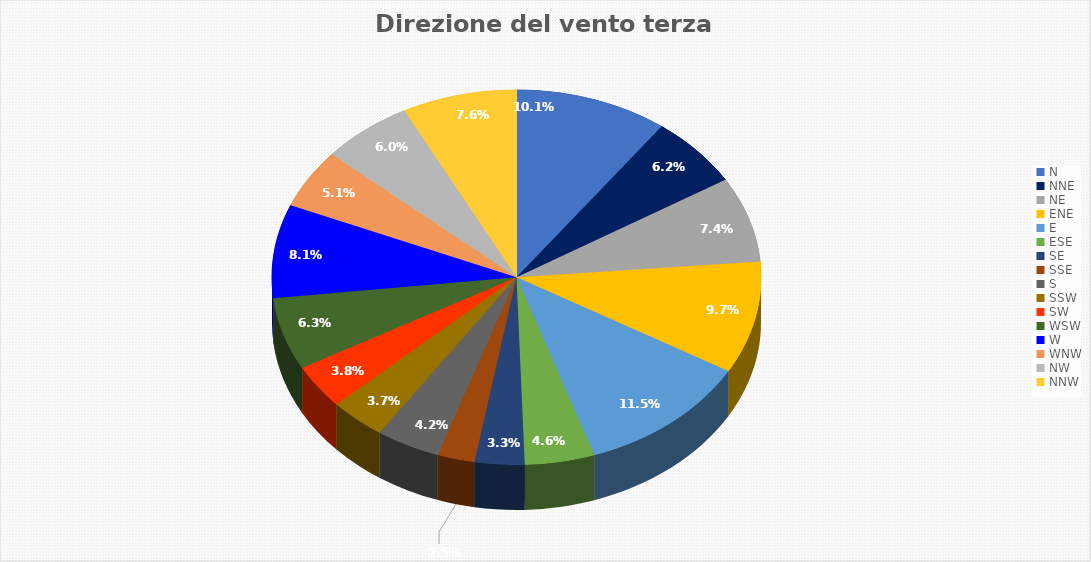
| Category | Percentuale |
|---|---|
| N | 10.107 |
| NNE | 6.191 |
| NE | 7.359 |
| ENE | 9.697 |
| E | 11.497 |
| ESE | 4.611 |
| SE | 3.285 |
| SSE | 2.464 |
| S | 4.232 |
| SSW | 3.696 |
| SW | 3.822 |
| WSW | 6.254 |
| W | 8.054 |
| WNW | 5.117 |
| NW | 6.033 |
| NNW | 7.581 |